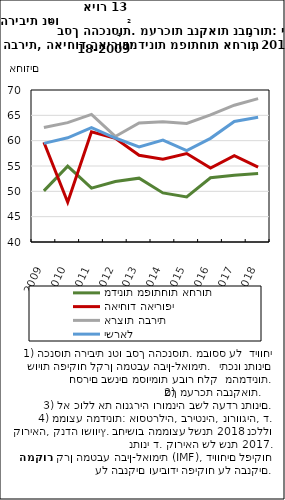
| Category | מדינות מפותחות אחרות | האיחוד האירופי | ארצות הברית | ישראל |
|---|---|---|---|---|
| 2009.0 | 50.094 | 59.677 | 62.597 | 59.463 |
| 2010.0 | 54.979 | 47.849 | 63.554 | 60.573 |
| 2011.0 | 50.632 | 61.742 | 65.181 | 62.584 |
| 2012.0 | 51.935 | 60.471 | 60.829 | 60.521 |
| 2013.0 | 52.601 | 57.123 | 63.489 | 58.768 |
| 2014.0 | 49.683 | 56.355 | 63.726 | 60.111 |
| 2015.0 | 48.902 | 57.47 | 63.402 | 58.033 |
| 2016.0 | 52.689 | 54.603 | 65.088 | 60.458 |
| 2017.0 | 53.197 | 57.049 | 67.003 | 63.778 |
| 2018.0 | 53.497 | 54.785 | 68.289 | 64.604 |